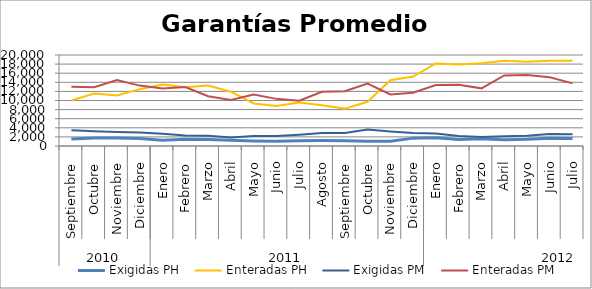
| Category | Exigidas PH | Enteradas PH | Exigidas PM | Enteradas PM |
|---|---|---|---|---|
| 0 | 1528.048 | 9989.528 | 3482.397 | 13040.893 |
| 1 | 1765.671 | 11522.563 | 3249.678 | 12931.878 |
| 2 | 1744.818 | 11123.372 | 3083.204 | 14519.409 |
| 3 | 1659.203 | 12493.623 | 2971.808 | 13273.812 |
| 4 | 1282.931 | 13511.197 | 2715.795 | 12631.271 |
| 5 | 1469.886 | 12912.935 | 2313.398 | 12967.84 |
| 6 | 1451.049 | 13292.147 | 2234.5 | 10944.124 |
| 7 | 1243.266 | 11940.059 | 1876.192 | 10106.188 |
| 8 | 1094.477 | 9346.935 | 2211.516 | 11309.35 |
| 9 | 1038.181 | 8772.488 | 2185.859 | 10360.845 |
| 10 | 1150.33 | 9583.522 | 2484.933 | 9954.534 |
| 11 | 1204.945 | 8947.225 | 2874.347 | 11912.953 |
| 12 | 1181.135 | 8218.837 | 2868.226 | 12046.458 |
| 13 | 1047.181 | 9725.758 | 3619.145 | 13704.352 |
| 14 | 1067.214 | 14456.861 | 3177.175 | 11327.495 |
| 15 | 1729.716 | 15271.717 | 2830.669 | 11719.895 |
| 16 | 1828.564 | 18155.583 | 2744.93 | 13413.991 |
| 17 | 1451.155 | 17917.734 | 2215.902 | 13440.832 |
| 18 | 1587.31 | 18166.129 | 1968.766 | 12673.714 |
| 19 | 1353.003 | 18741.256 | 2118.782 | 15515.723 |
| 20 | 1464.668 | 18540.927 | 2278.002 | 15625.393 |
| 21 | 1719.43 | 18734.539 | 2626.915 | 15127.903 |
| 22 | 1674.023 | 18761.463 | 2556.575 | 13766.49 |